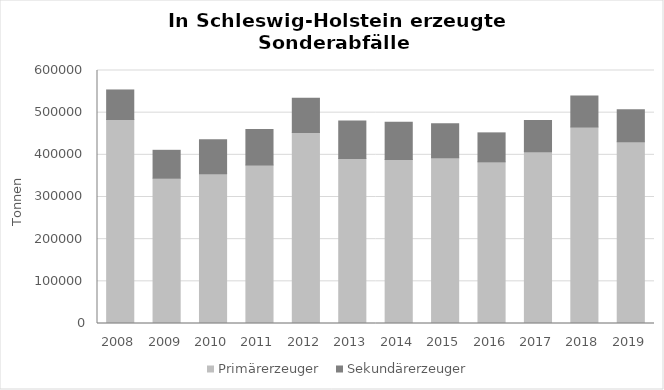
| Category | Primärerzeuger | Sekundärerzeuger |
|---|---|---|
| 2008.0 | 483769 | 70082 |
| 2009.0 | 344705 | 66025 |
| 2010.0 | 355164 | 80819 |
| 2011.0 | 375939 | 84429 |
| 2012.0 | 452834 | 81477 |
| 2013.0 | 391388 | 88807 |
| 2014.0 | 388854 | 88193 |
| 2015.0 | 392871 | 80689 |
| 2016.0 | 383445 | 68653 |
| 2017.0 | 407030 | 74519 |
| 2018.0 | 466122 | 73543 |
| 2019.0 | 431249 | 75688 |